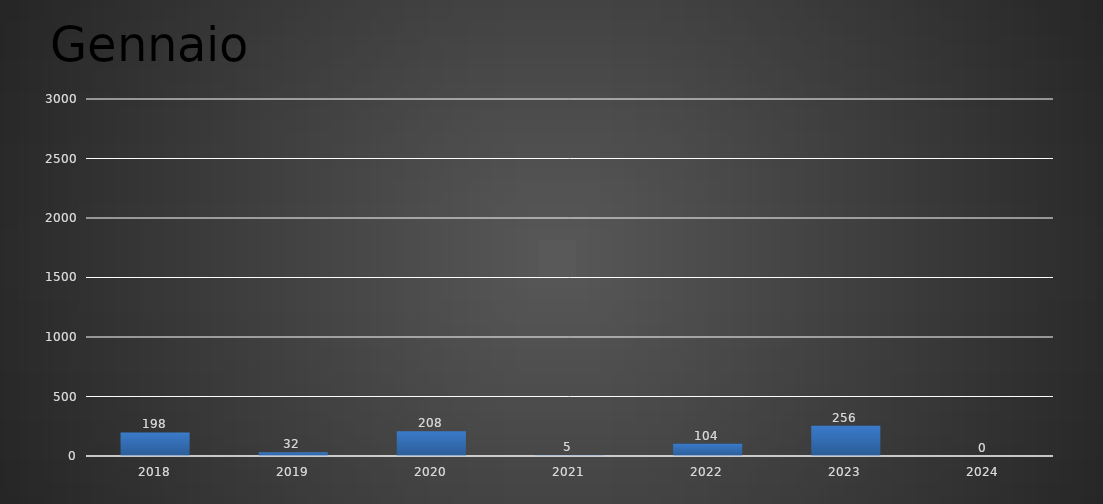
| Category | Gennaio |
|---|---|
| 2018.0 | 198 |
| 2019.0 | 32 |
| 2020.0 | 208 |
| 2021.0 | 5 |
| 2022.0 | 104 |
| 2023.0 | 256 |
| 2024.0 | 0 |